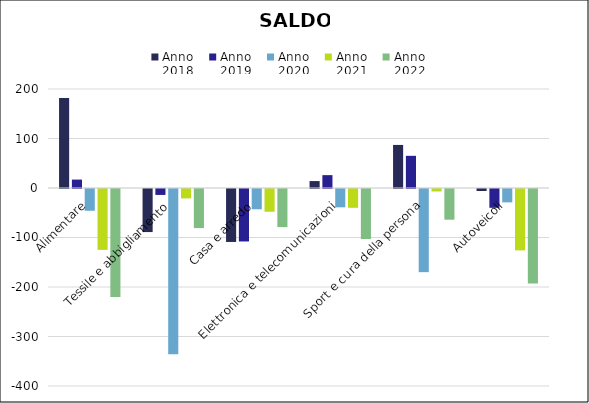
| Category | Anno
2018 | Anno
2019 | Anno
2020 | Anno
2021 | Anno
2022 |
|---|---|---|---|---|---|
| Alimentare | 182 | 17 | -44 | -123 | -218 |
| Tessile e abbigliamento | -87 | -12 | -334 | -19 | -79 |
| Casa e arredo | -107 | -106 | -41 | -46 | -77 |
| Elettronica e telecomunicazioni | 14 | 26 | -37 | -38 | -101 |
| Sport e cura della persona | 87 | 65 | -168 | -5 | -62 |
| Autoveicoli | -4 | -38 | -27 | -124 | -191 |